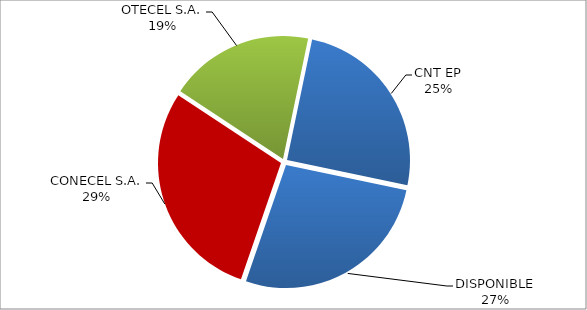
| Category | CÓDIGO DE RED 96 |
|---|---|
| CONECEL S.A. | 0.29 |
| OTECEL S.A. | 0.19 |
| CNT EP | 0.25 |
| DISPONIBLE | 0.27 |